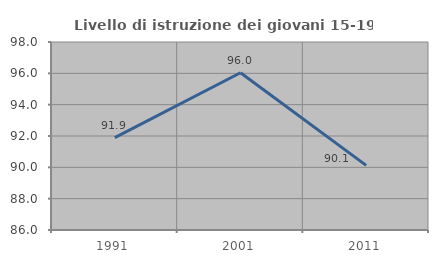
| Category | Livello di istruzione dei giovani 15-19 anni |
|---|---|
| 1991.0 | 91.892 |
| 2001.0 | 96.04 |
| 2011.0 | 90.123 |